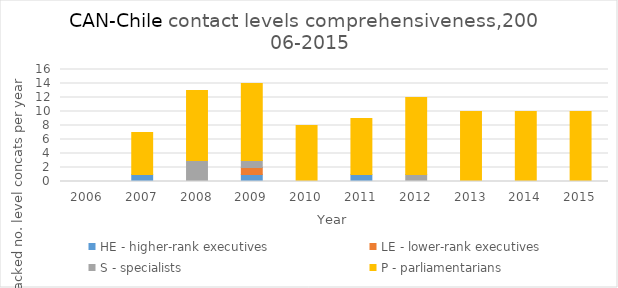
| Category | HE - higher-rank executives | LE - lower-rank executives | S - specialists | P - parliamentarians |
|---|---|---|---|---|
| 2006.0 | 0 | 0 | 0 | 0 |
| 2007.0 | 1 | 0 | 0 | 6 |
| 2008.0 | 0 | 0 | 3 | 10 |
| 2009.0 | 1 | 1 | 1 | 11 |
| 2010.0 | 0 | 0 | 0 | 8 |
| 2011.0 | 1 | 0 | 0 | 8 |
| 2012.0 | 0 | 0 | 1 | 11 |
| 2013.0 | 0 | 0 | 0 | 10 |
| 2014.0 | 0 | 0 | 0 | 10 |
| 2015.0 | 0 | 0 | 0 | 10 |